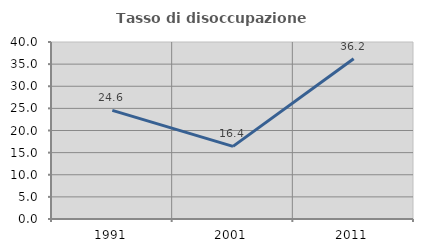
| Category | Tasso di disoccupazione giovanile  |
|---|---|
| 1991.0 | 24.561 |
| 2001.0 | 16.418 |
| 2011.0 | 36.232 |